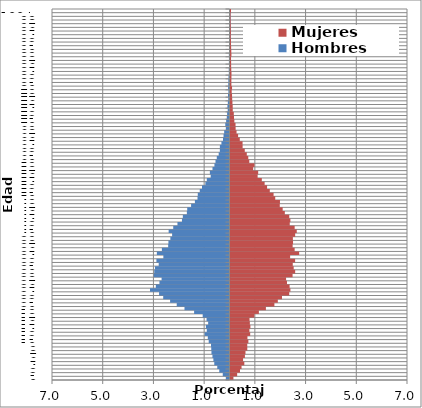
| Category | Hombres | Mujeres |
|---|---|---|
| 0 | -0.146 | 0.115 |
| 1 | -0.266 | 0.262 |
| 2 | -0.404 | 0.376 |
| 3 | -0.483 | 0.436 |
| 4 | -0.6 | 0.545 |
| 5 | -0.636 | 0.496 |
| 6 | -0.673 | 0.568 |
| 7 | -0.712 | 0.591 |
| 8 | -0.72 | 0.662 |
| 9 | -0.73 | 0.661 |
| 10 | -0.82 | 0.705 |
| 11 | -0.856 | 0.668 |
| 12 | -0.98 | 0.776 |
| 13 | -0.895 | 0.745 |
| 14 | -0.93 | 0.784 |
| 15 | -0.842 | 0.763 |
| 16 | -0.905 | 0.75 |
| 17 | -1.058 | 0.942 |
| 18 | -1.395 | 1.119 |
| 19 | -1.775 | 1.396 |
| 20 | -2.081 | 1.731 |
| 21 | -2.343 | 1.866 |
| 22 | -2.615 | 2.031 |
| 23 | -2.777 | 2.316 |
| 24 | -3.135 | 2.363 |
| 25 | -2.905 | 2.331 |
| 26 | -2.764 | 2.228 |
| 27 | -2.678 | 2.192 |
| 28 | -2.986 | 2.448 |
| 29 | -2.968 | 2.55 |
| 30 | -2.94 | 2.492 |
| 31 | -2.792 | 2.455 |
| 32 | -2.882 | 2.548 |
| 33 | -2.609 | 2.352 |
| 34 | -2.865 | 2.708 |
| 35 | -2.667 | 2.53 |
| 36 | -2.419 | 2.45 |
| 37 | -2.409 | 2.466 |
| 38 | -2.333 | 2.46 |
| 39 | -2.263 | 2.55 |
| 40 | -2.4 | 2.613 |
| 41 | -2.219 | 2.53 |
| 42 | -2.053 | 2.337 |
| 43 | -1.875 | 2.362 |
| 44 | -1.84 | 2.317 |
| 45 | -1.682 | 2.143 |
| 46 | -1.667 | 2.058 |
| 47 | -1.515 | 1.943 |
| 48 | -1.365 | 1.95 |
| 49 | -1.262 | 1.764 |
| 50 | -1.251 | 1.699 |
| 51 | -1.173 | 1.55 |
| 52 | -1.084 | 1.443 |
| 53 | -0.952 | 1.346 |
| 54 | -0.895 | 1.235 |
| 55 | -0.741 | 1.07 |
| 56 | -0.774 | 1.092 |
| 57 | -0.671 | 0.895 |
| 58 | -0.595 | 0.945 |
| 59 | -0.553 | 0.741 |
| 60 | -0.502 | 0.701 |
| 61 | -0.426 | 0.642 |
| 62 | -0.381 | 0.563 |
| 63 | -0.38 | 0.478 |
| 64 | -0.318 | 0.476 |
| 65 | -0.256 | 0.367 |
| 66 | -0.235 | 0.3 |
| 67 | -0.21 | 0.238 |
| 68 | -0.144 | 0.202 |
| 69 | -0.166 | 0.198 |
| 70 | -0.133 | 0.152 |
| 71 | -0.107 | 0.138 |
| 72 | -0.094 | 0.13 |
| 73 | -0.071 | 0.089 |
| 74 | -0.083 | 0.087 |
| 75 | -0.066 | 0.076 |
| 76 | -0.049 | 0.066 |
| 77 | -0.059 | 0.061 |
| 78 | -0.043 | 0.047 |
| 79 | -0.055 | 0.061 |
| 80 | -0.049 | 0.035 |
| 81 | -0.045 | 0.034 |
| 82 | -0.039 | 0.037 |
| 83 | -0.026 | 0.039 |
| 84 | -0.03 | 0.03 |
| 85 | -0.018 | 0.025 |
| 86 | -0.024 | 0.025 |
| 87 | -0.022 | 0.021 |
| 88 | -0.025 | 0.037 |
| 89 | -0.017 | 0.031 |
| 90 | -0.02 | 0.025 |
| 91 | -0.008 | 0.02 |
| 92 | -0.01 | 0.018 |
| 93 | -0.011 | 0.011 |
| 94 | -0.015 | 0.016 |
| 95 | -0.006 | 0.012 |
| 96 | -0.003 | 0.011 |
| 97 | -0.008 | 0.006 |
| 98 | -0.002 | 0.004 |
| 99 | -0.001 | 0.004 |
| 100+ | -0.017 | 0.02 |